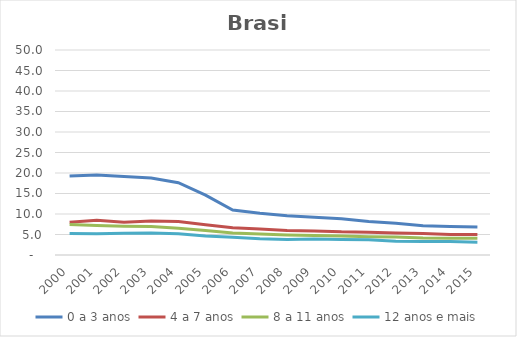
| Category | 0 a 3 anos | 4 a 7 anos | 8 a 11 anos | 12 anos e mais |
|---|---|---|---|---|
| 2000.0 | 19.265 | 8.016 | 7.41 | 5.237 |
| 2001.0 | 19.523 | 8.45 | 7.183 | 5.213 |
| 2002.0 | 19.13 | 8.001 | 6.987 | 5.321 |
| 2003.0 | 18.754 | 8.309 | 6.933 | 5.346 |
| 2004.0 | 17.62 | 8.148 | 6.523 | 5.17 |
| 2005.0 | 14.608 | 7.384 | 5.972 | 4.624 |
| 2006.0 | 10.983 | 6.652 | 5.384 | 4.306 |
| 2007.0 | 10.165 | 6.325 | 5.151 | 3.965 |
| 2008.0 | 9.589 | 5.984 | 4.883 | 3.789 |
| 2009.0 | 9.234 | 5.879 | 4.759 | 3.916 |
| 2010.0 | 8.849 | 5.641 | 4.657 | 3.805 |
| 2011.0 | 8.185 | 5.569 | 4.453 | 3.694 |
| 2012.0 | 7.765 | 5.336 | 4.364 | 3.337 |
| 2013.0 | 7.138 | 5.236 | 4.119 | 3.275 |
| 2014.0 | 6.955 | 5.008 | 4.056 | 3.268 |
| 2015.0 | 6.818 | 5.021 | 4.078 | 3.125 |